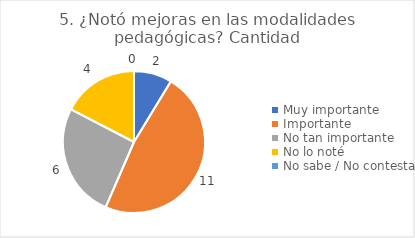
| Category | 5. ¿Notó mejoras en las modalidades pedagógicas? |
|---|---|
| Muy importante  | 0.087 |
| Importante  | 0.478 |
| No tan importante  | 0.261 |
| No lo noté  | 0.174 |
| No sabe / No contesta | 0 |